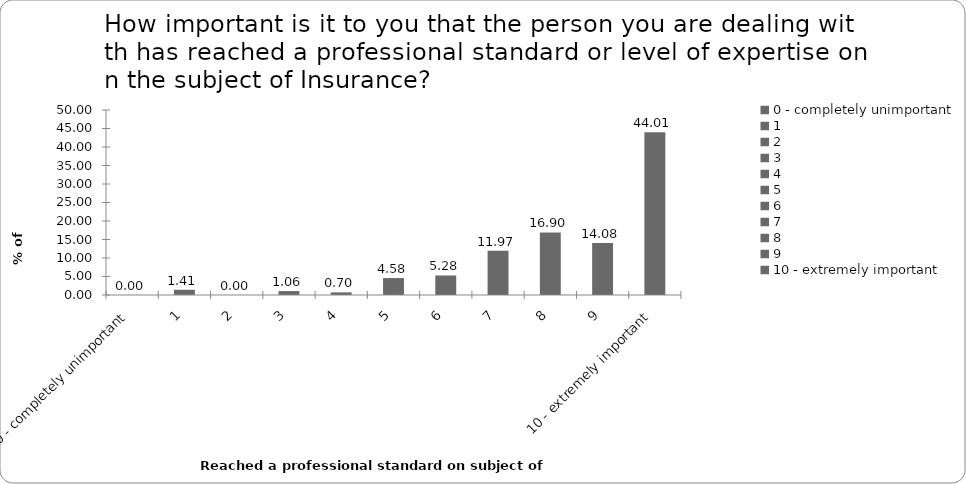
| Category | % of Respondents |
|---|---|
| 0 - completely unimportant | 0 |
| 1 | 1.408 |
| 2 | 0 |
| 3 | 1.056 |
| 4 | 0.704 |
| 5 | 4.577 |
| 6 | 5.282 |
| 7 | 11.972 |
| 8 | 16.901 |
| 9 | 14.085 |
| 10 - extremely important | 44.014 |